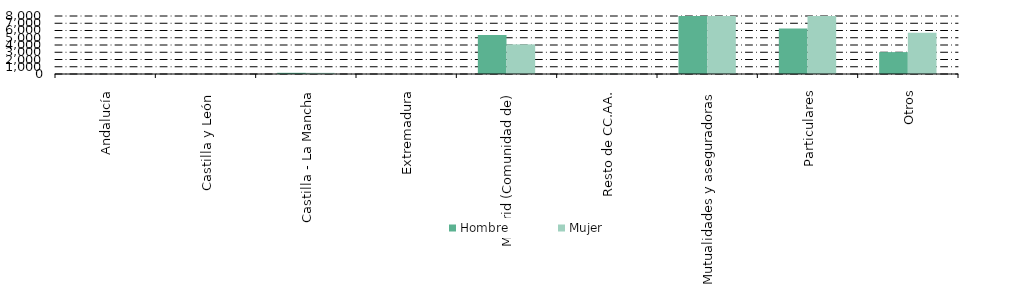
| Category | Hombre | Mujer |
|---|---|---|
| Andalucía | 5 | 1 |
| Castilla y León  | 1 | 2 |
| Castilla - La Mancha | 166 | 160 |
| Extremadura | 2 | 1 |
| Madrid (Comunidad de) | 5367 | 4087 |
| Resto de CC.AA. | 20 | 23 |
| Mutualidades y aseguradoras | 102699 | 112535 |
| Particulares | 6286 | 13201 |
| Otros | 3021 | 5685 |